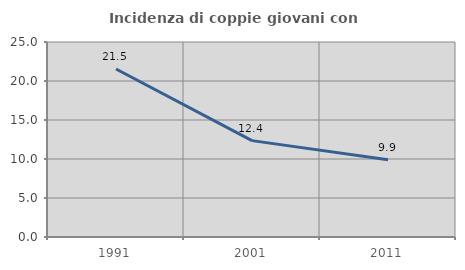
| Category | Incidenza di coppie giovani con figli |
|---|---|
| 1991.0 | 21.537 |
| 2001.0 | 12.354 |
| 2011.0 | 9.902 |